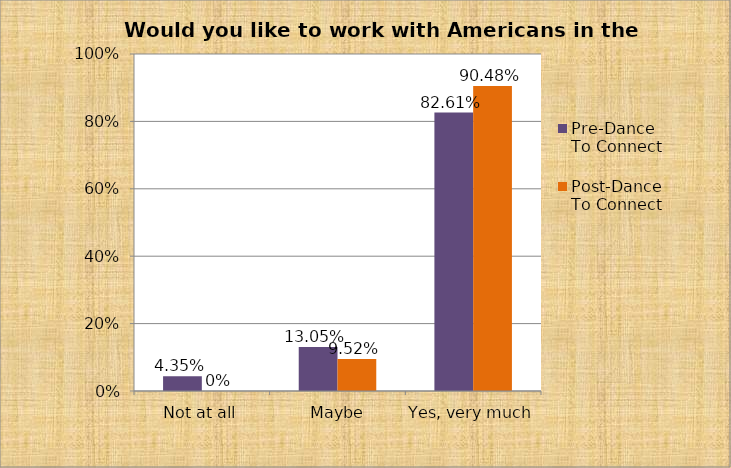
| Category | Pre-Dance To Connect | Post-Dance To Connect |
|---|---|---|
| Not at all | 0.044 | 0 |
|  Maybe | 0.13 | 0.095 |
| Yes, very much | 0.826 | 0.905 |